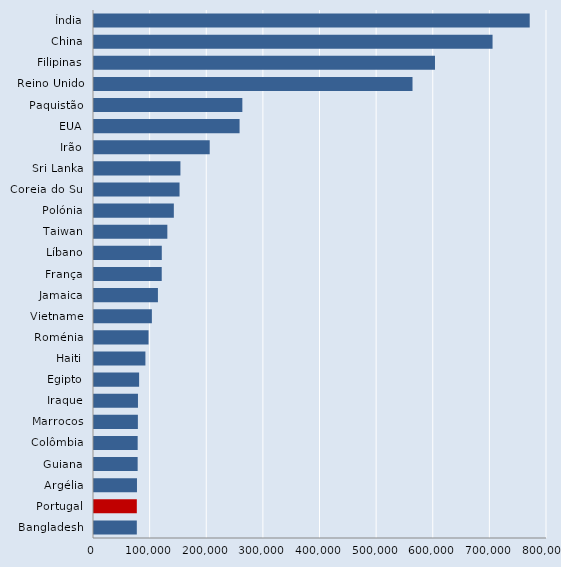
| Category | Series 0 |
|---|---|
| Índia | 769480 |
| China | 703849 |
| Filipinas | 602187 |
| Reino Unido | 562490 |
| Paquistão | 261993 |
| EUA | 257087 |
| Irão | 204340 |
| Sri Lanka | 152622 |
| Coreia do Sul | 151067 |
| Polónia | 140996 |
| Taiwan | 129525 |
| Líbano | 119707 |
| França | 119599 |
| Jamaica | 112888 |
| Vietname | 102212 |
| Roménia | 96310 |
| Haiti | 90789 |
| Egipto | 79667 |
| Iraque | 77648 |
| Marrocos | 77498 |
| Colômbia | 77126 |
| Guiana | 77095 |
| Argélia | 75907 |
| Portugal | 75619 |
| Bangladesh | 75619 |